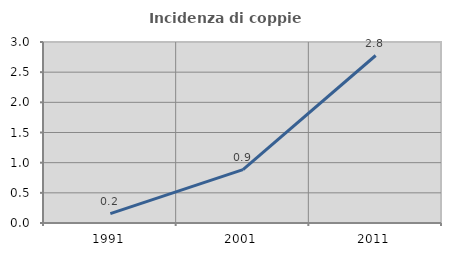
| Category | Incidenza di coppie miste |
|---|---|
| 1991.0 | 0.155 |
| 2001.0 | 0.886 |
| 2011.0 | 2.776 |